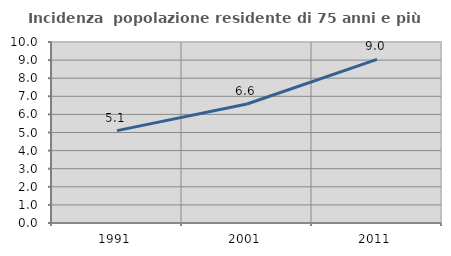
| Category | Incidenza  popolazione residente di 75 anni e più |
|---|---|
| 1991.0 | 5.102 |
| 2001.0 | 6.575 |
| 2011.0 | 9.043 |